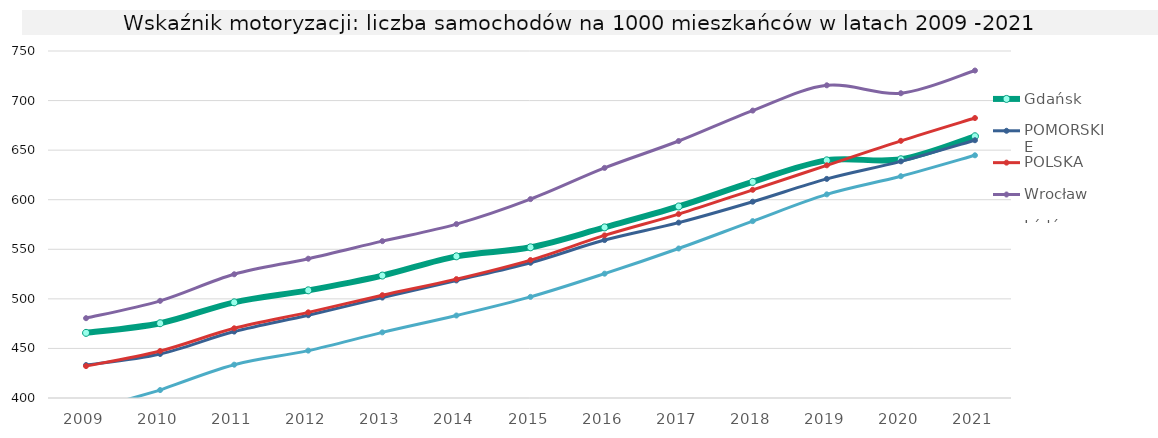
| Category | Gdańsk | POMORSKIE | POLSKA | Wrocław | Łódź |
|---|---|---|---|---|---|
| 2009.0 | 465.7 | 433.2 | 432.2 | 480.5 | 386.5 |
| 2010.0 | 475.4 | 444.4 | 447.4 | 498 | 408 |
| 2011.0 | 496.5 | 467 | 470.3 | 524.8 | 433.6 |
| 2012.0 | 508.6 | 483.5 | 486.4 | 540.5 | 447.8 |
| 2013.0 | 523.5 | 501.3 | 503.7 | 558.2 | 466.2 |
| 2014.0 | 542.9 | 518.6 | 519.9 | 575.4 | 483.2 |
| 2015.0 | 552 | 536.4 | 539.1 | 600.6 | 502 |
| 2016.0 | 572.1 | 559.3 | 564 | 632.1 | 525.4 |
| 2017.0 | 593.2 | 576.9 | 585.5 | 659.2 | 550.8 |
| 2018.0 | 618 | 598 | 610 | 689.9 | 578.4 |
| 2019.0 | 639.7 | 621 | 634.7 | 715.4 | 605.4 |
| 2020.0 | 640.8 | 638.7 | 659.4 | 707.4 | 623.7 |
| 2021.0 | 664 | 660 | 682.4 | 730.3 | 644.8 |